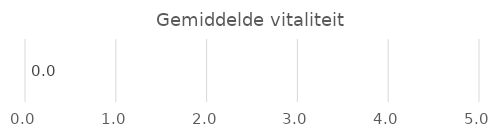
| Category | Series 0 |
|---|---|
| Vitaliteit | 0 |